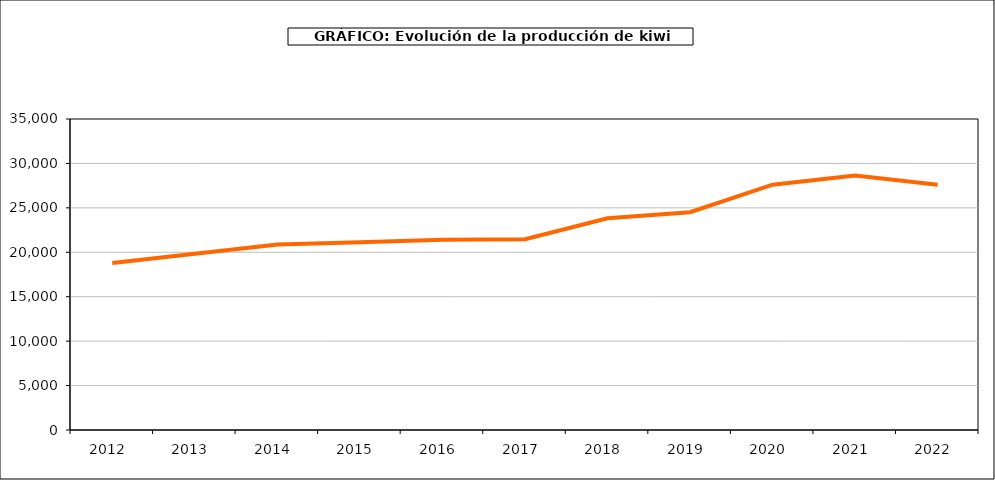
| Category | producción kiwi |
|---|---|
| 2012.0 | 18804 |
| 2013.0 | 19834 |
| 2014.0 | 20884 |
| 2015.0 | 21135 |
| 2016.0 | 21409 |
| 2017.0 | 21463 |
| 2018.0 | 23833 |
| 2019.0 | 24508 |
| 2020.0 | 27613 |
| 2021.0 | 28654 |
| 2022.0 | 27593 |